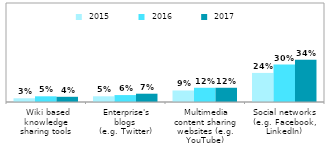
| Category |  2015 |  2016 |  2017 |
|---|---|---|---|
|  Wiki based knowledge sharing tools | 0.03 | 0.046 | 0.042 |
|  Enterprise's blogs
(e.g. Twitter) | 0.046 | 0.056 | 0.067 |
|  Multimedia content sharing websites (e.g. YouTube) | 0.093 | 0.115 | 0.115 |
| Social networks
(e.g. Facebook, LinkedIn) | 0.235 | 0.303 | 0.341 |